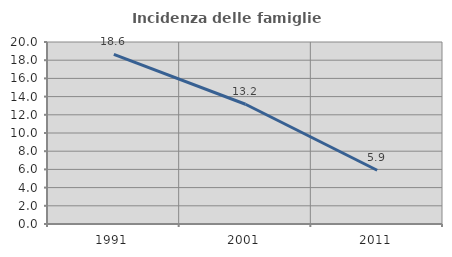
| Category | Incidenza delle famiglie numerose |
|---|---|
| 1991.0 | 18.634 |
| 2001.0 | 13.158 |
| 2011.0 | 5.909 |